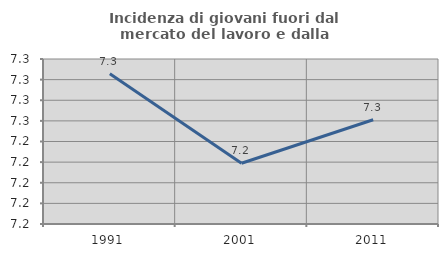
| Category | Incidenza di giovani fuori dal mercato del lavoro e dalla formazione  |
|---|---|
| 1991.0 | 7.306 |
| 2001.0 | 7.219 |
| 2011.0 | 7.261 |